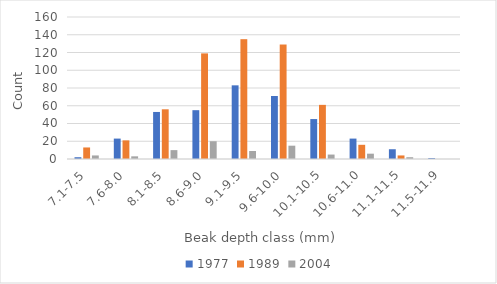
| Category | 1977 | 1989 | 2004 |
|---|---|---|---|
| 7.1-7.5 | 2 | 13 | 4 |
| 7.6-8.0 | 23 | 21 | 3 |
| 8.1-8.5 | 53 | 56 | 10 |
| 8.6-9.0 | 55 | 119 | 20 |
| 9.1-9.5 | 83 | 135 | 9 |
| 9.6-10.0 | 71 | 129 | 15 |
| 10.1-10.5 | 45 | 61 | 5 |
| 10.6-11.0 | 23 | 16 | 6 |
| 11.1-11.5 | 11 | 4 | 2 |
| 11.5-11.9 | 1 | 0 | 0 |